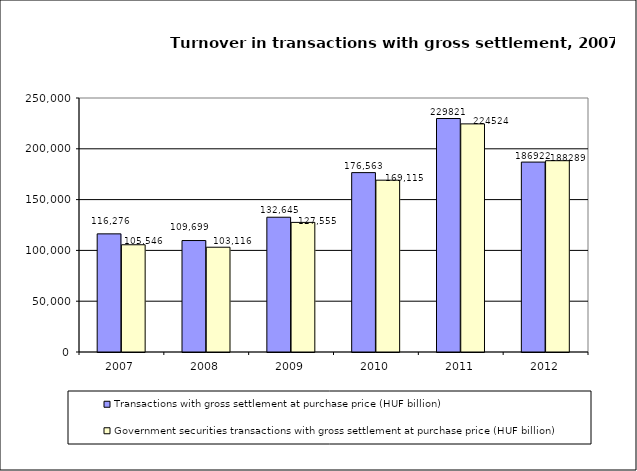
| Category | Transactions with gross settlement at purchase price (HUF billion) | Government securities transactions with gross settlement at purchase price (HUF billion) |
|---|---|---|
| 2007.0 | 116276 | 105545.79 |
| 2008.0 | 109699 | 103116 |
| 2009.0 | 132645 | 127555 |
| 2010.0 | 176563 | 169115 |
| 2011.0 | 229821 | 224524 |
| 2012.0 | 186922 | 188289 |